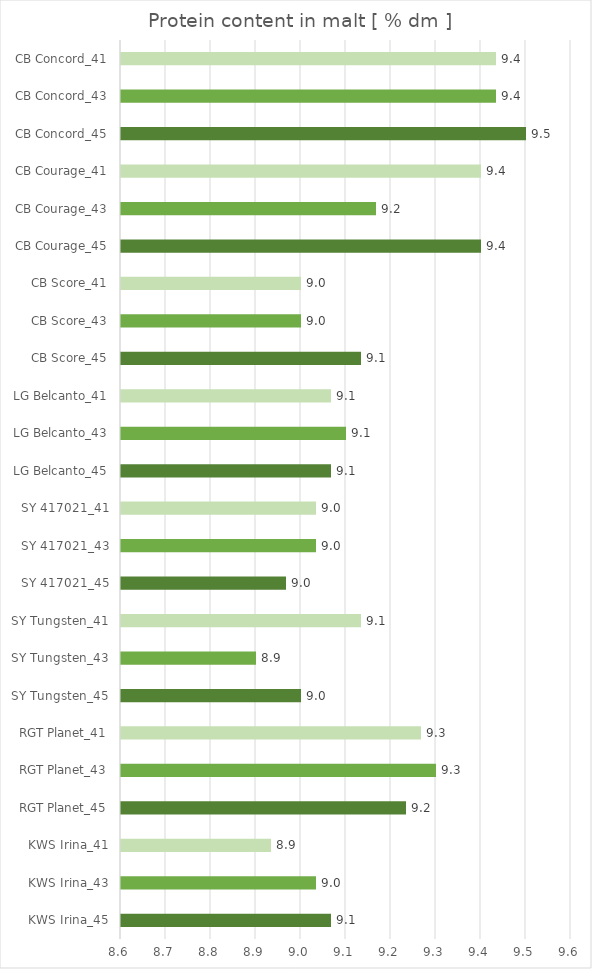
| Category |   Protein content [ % dm ] |
|---|---|
| KWS Irina_45 | 9.067 |
| KWS Irina_43 | 9.033 |
| KWS Irina_41 | 8.933 |
| RGT Planet_45 | 9.233 |
| RGT Planet_43 | 9.3 |
| RGT Planet_41 | 9.267 |
| SY Tungsten_45 | 9 |
| SY Tungsten_43 | 8.9 |
| SY Tungsten_41 | 9.133 |
| SY 417021_45 | 8.967 |
| SY 417021_43 | 9.033 |
| SY 417021_41 | 9.033 |
| LG Belcanto_45 | 9.067 |
| LG Belcanto_43 | 9.1 |
| LG Belcanto_41 | 9.067 |
| CB Score_45 | 9.133 |
| CB Score_43 | 9 |
| CB Score_41 | 9 |
| CB Courage_45 | 9.4 |
| CB Courage_43 | 9.167 |
| CB Courage_41 | 9.4 |
| CB Concord_45 | 9.5 |
| CB Concord_43 | 9.433 |
| CB Concord_41 | 9.433 |